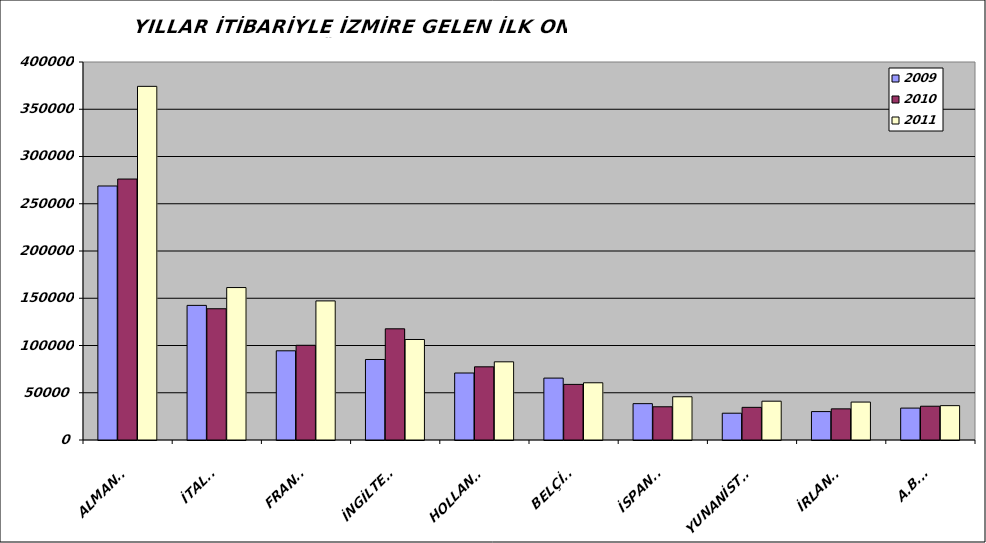
| Category | 2009 | 2010 | 2011 |
|---|---|---|---|
| ALMANYA | 268790 | 276155 | 374237 |
| İTALYA | 142449 | 138903 | 161320 |
| FRANSA | 94388 | 100248 | 147179 |
| İNGİLTERE | 85188 | 117666 | 106359 |
| HOLLANDA | 70895 | 77439 | 82735 |
| BELÇİKA | 65497 | 58842 | 60553 |
| İSPANYA | 38468 | 35153 | 45758 |
| YUNANİSTAN | 28344 | 34553 | 41066 |
| İRLANDA | 30066 | 32964 | 40129 |
| A.B.D. | 33760 | 35746 | 36350 |